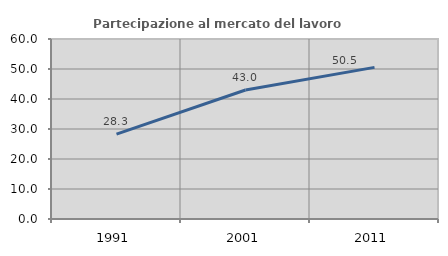
| Category | Partecipazione al mercato del lavoro  femminile |
|---|---|
| 1991.0 | 28.283 |
| 2001.0 | 43.011 |
| 2011.0 | 50.538 |